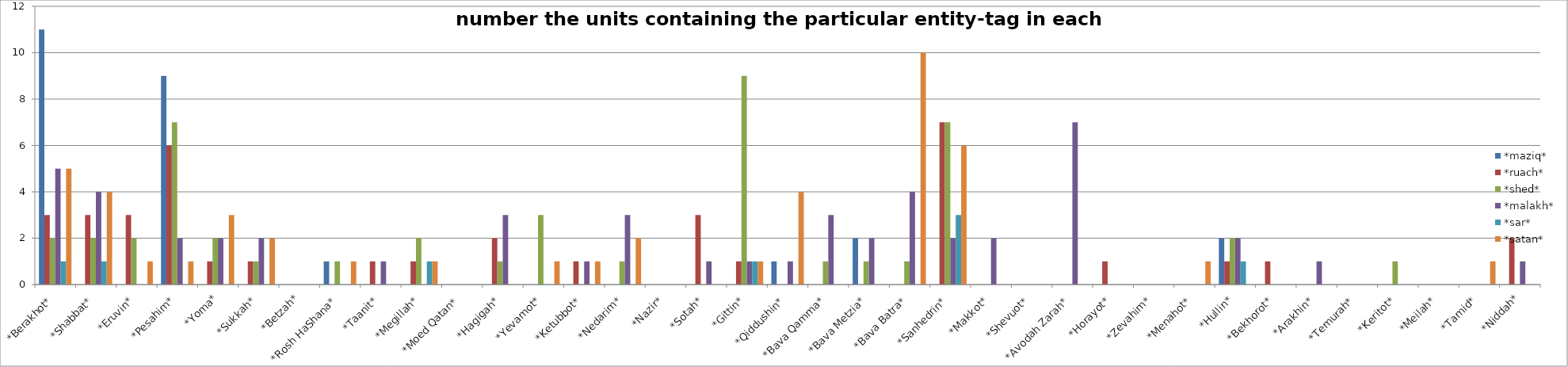
| Category | *maziq* | *ruach* | *shed* | *malakh* | *sar* | *satan* |
|---|---|---|---|---|---|---|
| *Berakhot* | 11 | 3 | 2 | 5 | 1 | 5 |
| *Shabbat* | 0 | 3 | 2 | 4 | 1 | 4 |
| *Eruvin* | 0 | 3 | 2 | 0 | 0 | 1 |
| *Pesahim* | 9 | 6 | 7 | 2 | 0 | 1 |
| *Yoma* | 0 | 1 | 2 | 2 | 0 | 3 |
| *Sukkah* | 0 | 1 | 1 | 2 | 0 | 2 |
| *Betzah* | 0 | 0 | 0 | 0 | 0 | 0 |
| *Rosh HaShana* | 1 | 0 | 1 | 0 | 0 | 1 |
| *Taanit* | 0 | 1 | 0 | 1 | 0 | 0 |
| *Megillah* | 0 | 1 | 2 | 0 | 1 | 1 |
| *Moed Qatan* | 0 | 0 | 0 | 0 | 0 | 0 |
| *Hagigah* | 0 | 2 | 1 | 3 | 0 | 0 |
| *Yevamot* | 0 | 0 | 3 | 0 | 0 | 1 |
| *Ketubbot* | 0 | 1 | 0 | 1 | 0 | 1 |
| *Nedarim* | 0 | 0 | 1 | 3 | 0 | 2 |
| *Nazir* | 0 | 0 | 0 | 0 | 0 | 0 |
| *Sotah* | 0 | 3 | 0 | 1 | 0 | 0 |
| *Gittin* | 0 | 1 | 9 | 1 | 1 | 1 |
| *Qiddushin* | 1 | 0 | 0 | 1 | 0 | 4 |
| *Bava Qamma* | 0 | 0 | 1 | 3 | 0 | 0 |
| *Bava Metzia* | 2 | 0 | 1 | 2 | 0 | 0 |
| *Bava Batra* | 0 | 0 | 1 | 4 | 0 | 10 |
| *Sanhedrin* | 0 | 7 | 7 | 2 | 3 | 6 |
| *Makkot* | 0 | 0 | 0 | 2 | 0 | 0 |
| *Shevuot* | 0 | 0 | 0 | 0 | 0 | 0 |
| *Avodah Zarah* | 0 | 0 | 0 | 7 | 0 | 0 |
| *Horayot* | 0 | 1 | 0 | 0 | 0 | 0 |
| *Zevahim* | 0 | 0 | 0 | 0 | 0 | 0 |
| *Menahot* | 0 | 0 | 0 | 0 | 0 | 1 |
| *Hullin* | 2 | 1 | 2 | 2 | 1 | 0 |
| *Bekhorot* | 0 | 1 | 0 | 0 | 0 | 0 |
| *Arakhin* | 0 | 0 | 0 | 1 | 0 | 0 |
| *Temurah* | 0 | 0 | 0 | 0 | 0 | 0 |
| *Keritot* | 0 | 0 | 1 | 0 | 0 | 0 |
| *Meilah* | 0 | 0 | 0 | 0 | 0 | 0 |
| *Tamid* | 0 | 0 | 0 | 0 | 0 | 1 |
| *Niddah* | 0 | 2 | 0 | 1 | 0 | 0 |